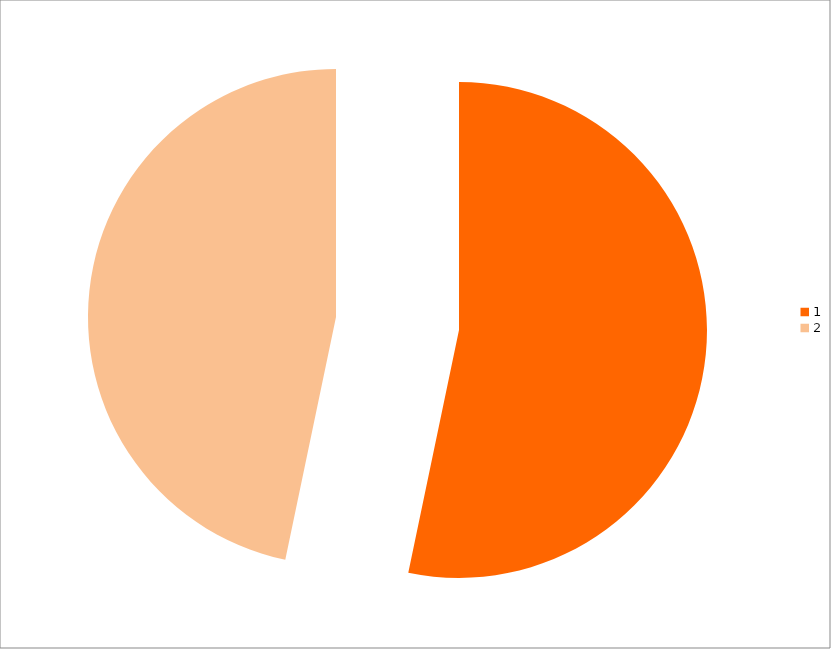
| Category | Series 0 |
|---|---|
| 0 | 65 |
| 1 | 57 |